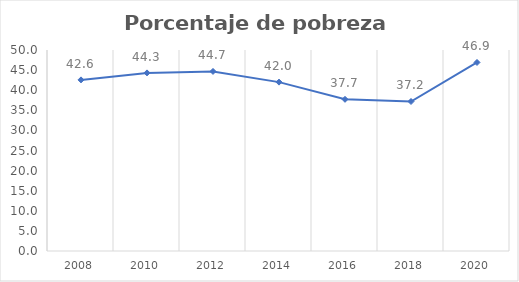
| Category | Series 0 |
|---|---|
| 2008.0 | 42.567 |
| 2010.0 | 44.306 |
| 2012.0 | 44.671 |
| 2014.0 | 42.011 |
| 2016.0 | 37.731 |
| 2018.0 | 37.192 |
| 2020.0 | 46.899 |